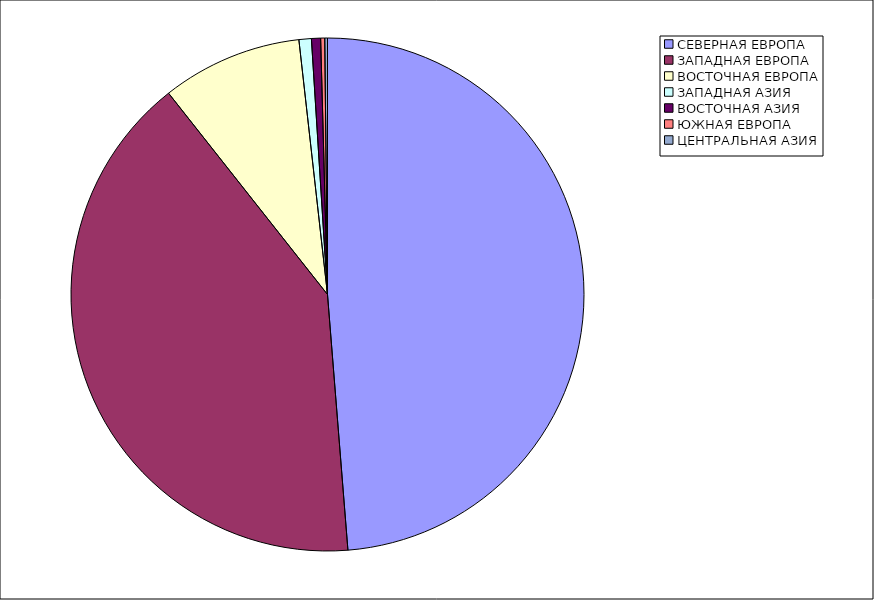
| Category | Оборот |
|---|---|
| СЕВЕРНАЯ ЕВРОПА | 48.73 |
| ЗАПАДНАЯ ЕВРОПА | 40.632 |
| ВОСТОЧНАЯ ЕВРОПА | 8.857 |
| ЗАПАДНАЯ АЗИЯ | 0.781 |
| ВОСТОЧНАЯ АЗИЯ | 0.574 |
| ЮЖНАЯ ЕВРОПА | 0.255 |
| ЦЕНТРАЛЬНАЯ АЗИЯ | 0.171 |